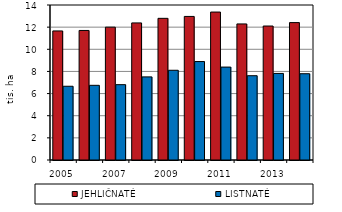
| Category | JEHLIČNATÉ | LISTNATÉ |
|---|---|---|
| 2005.0 | 11658 | 6660 |
| 2006.0 | 11700 | 6745 |
| 2007.0 | 11999 | 6805 |
| 2008.0 | 12382 | 7506 |
| 2009.0 | 12795 | 8105 |
| 2010.0 | 12967 | 8892 |
| 2011.0 | 13363 | 8392 |
| 2012.0 | 12290 | 7613 |
| 2013.0 | 12101 | 7819 |
| 2014.0 | 12410 | 7793 |